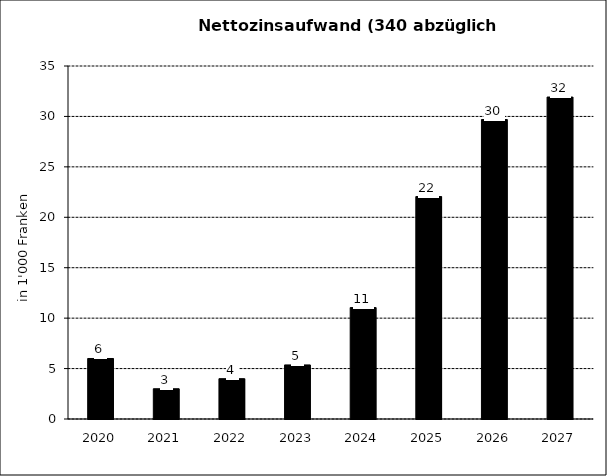
| Category | Nettozinsaufwand (340 abzüglich 440) |
|---|---|
| 2020.0 | 6 |
| 2021.0 | 3 |
| 2022.0 | 4 |
| 2023.0 | 5.363 |
| 2024.0 | 11.047 |
| 2025.0 | 22.053 |
| 2026.0 | 29.694 |
| 2027.0 | 31.923 |